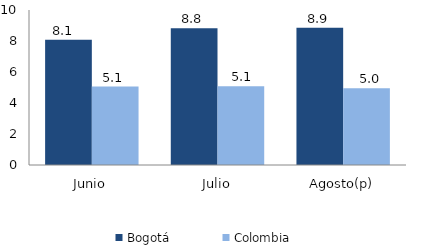
| Category | Bogotá | Colombia |
|---|---|---|
| Junio | 8.074 | 5.057 |
| Julio | 8.822 | 5.087 |
| Agosto(p) | 8.859 | 4.951 |